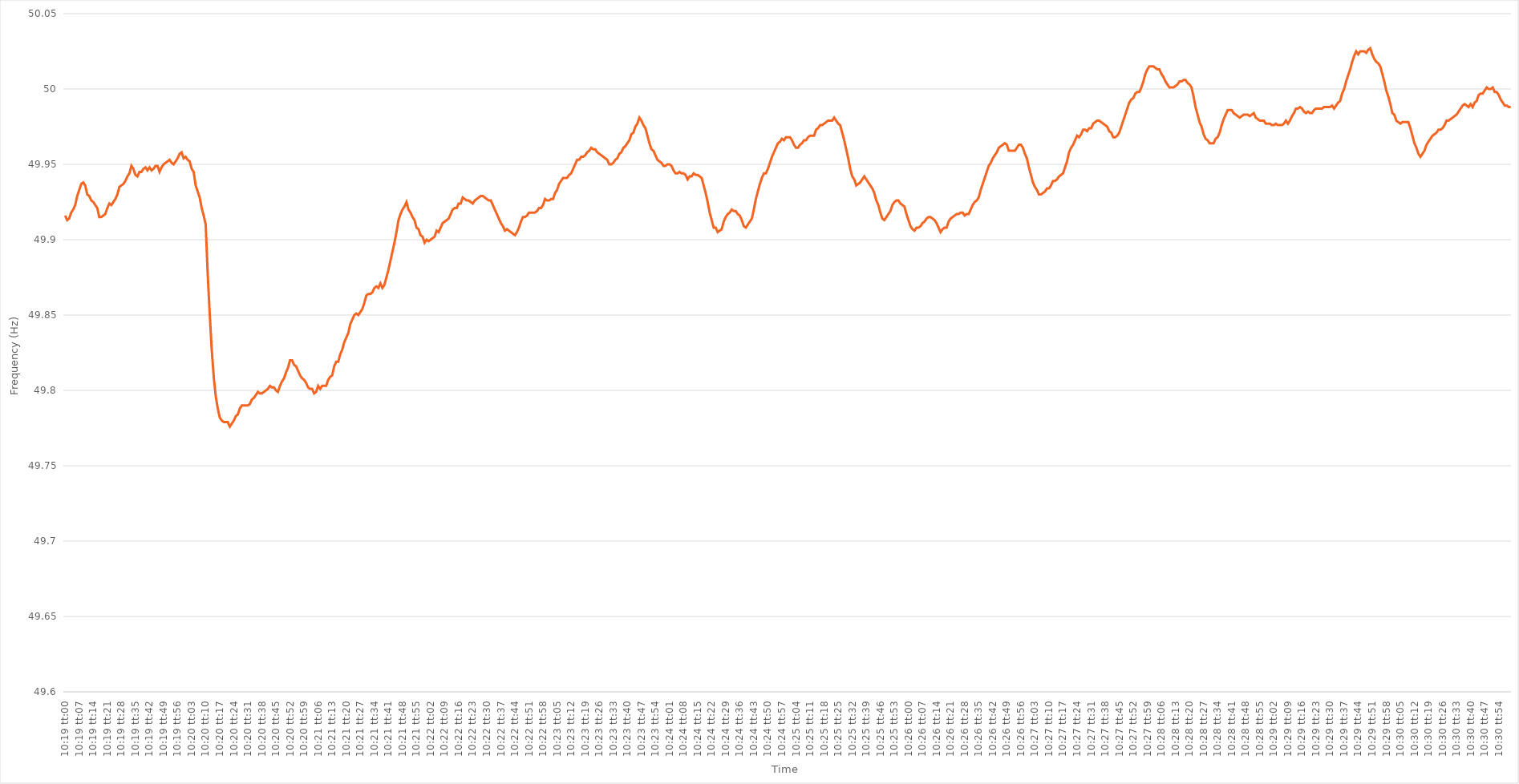
| Category | Series 0 |
|---|---|
| 0.4298611111111111 | 49.916 |
| 0.42987268518518523 | 49.913 |
| 0.42988425925925927 | 49.914 |
| 0.42989583333333337 | 49.918 |
| 0.4299074074074074 | 49.92 |
| 0.4299189814814815 | 49.923 |
| 0.42993055555555554 | 49.929 |
| 0.4299421296296296 | 49.933 |
| 0.4299537037037037 | 49.937 |
| 0.42996527777777777 | 49.938 |
| 0.42997685185185186 | 49.936 |
| 0.4299884259259259 | 49.93 |
| 0.43 | 49.929 |
| 0.43001157407407403 | 49.926 |
| 0.4300231481481482 | 49.925 |
| 0.4300347222222222 | 49.923 |
| 0.4300462962962963 | 49.921 |
| 0.43005787037037035 | 49.915 |
| 0.43006944444444445 | 49.915 |
| 0.4300810185185185 | 49.916 |
| 0.43009259259259264 | 49.917 |
| 0.4301041666666667 | 49.921 |
| 0.43011574074074077 | 49.924 |
| 0.4301273148148148 | 49.923 |
| 0.4301388888888889 | 49.925 |
| 0.43015046296296294 | 49.927 |
| 0.430162037037037 | 49.93 |
| 0.43017361111111113 | 49.935 |
| 0.43018518518518517 | 49.936 |
| 0.43019675925925926 | 49.937 |
| 0.4302083333333333 | 49.939 |
| 0.4302199074074074 | 49.942 |
| 0.43023148148148144 | 49.944 |
| 0.4302430555555556 | 49.949 |
| 0.4302546296296296 | 49.947 |
| 0.4302662037037037 | 49.943 |
| 0.43027777777777776 | 49.942 |
| 0.43028935185185185 | 49.945 |
| 0.4303009259259259 | 49.945 |
| 0.43031250000000004 | 49.947 |
| 0.4303240740740741 | 49.948 |
| 0.4303356481481482 | 49.946 |
| 0.4303472222222222 | 49.948 |
| 0.4303587962962963 | 49.946 |
| 0.43037037037037035 | 49.947 |
| 0.4303819444444445 | 49.949 |
| 0.43039351851851854 | 49.949 |
| 0.43040509259259263 | 49.945 |
| 0.43041666666666667 | 49.948 |
| 0.4304282407407407 | 49.95 |
| 0.4304398148148148 | 49.951 |
| 0.43045138888888884 | 49.952 |
| 0.430462962962963 | 49.953 |
| 0.43047453703703703 | 49.951 |
| 0.4304861111111111 | 49.95 |
| 0.43049768518518516 | 49.952 |
| 0.43050925925925926 | 49.954 |
| 0.4305208333333333 | 49.957 |
| 0.43053240740740745 | 49.958 |
| 0.4305439814814815 | 49.954 |
| 0.4305555555555556 | 49.955 |
| 0.4305671296296296 | 49.953 |
| 0.4305787037037037 | 49.952 |
| 0.43059027777777775 | 49.947 |
| 0.4306018518518519 | 49.945 |
| 0.43061342592592594 | 49.936 |
| 0.43062500000000004 | 49.932 |
| 0.4306365740740741 | 49.928 |
| 0.4306481481481481 | 49.921 |
| 0.4306597222222222 | 49.916 |
| 0.43067129629629625 | 49.91 |
| 0.4306828703703704 | 49.877 |
| 0.43069444444444444 | 49.851 |
| 0.43070601851851853 | 49.827 |
| 0.43071759259259257 | 49.809 |
| 0.43072916666666666 | 49.796 |
| 0.4307407407407407 | 49.788 |
| 0.43075231481481485 | 49.782 |
| 0.4307638888888889 | 49.78 |
| 0.430775462962963 | 49.779 |
| 0.430787037037037 | 49.779 |
| 0.4307986111111111 | 49.779 |
| 0.43081018518518516 | 49.776 |
| 0.4308217592592593 | 49.778 |
| 0.43083333333333335 | 49.78 |
| 0.43084490740740744 | 49.783 |
| 0.4308564814814815 | 49.784 |
| 0.4308680555555555 | 49.788 |
| 0.4308796296296296 | 49.79 |
| 0.43089120370370365 | 49.79 |
| 0.4309027777777778 | 49.79 |
| 0.43091435185185184 | 49.79 |
| 0.43092592592592593 | 49.791 |
| 0.4309375 | 49.794 |
| 0.43094907407407407 | 49.795 |
| 0.4309606481481481 | 49.797 |
| 0.43097222222222226 | 49.799 |
| 0.4309837962962963 | 49.798 |
| 0.4309953703703704 | 49.798 |
| 0.43100694444444443 | 49.799 |
| 0.4310185185185185 | 49.8 |
| 0.43103009259259256 | 49.801 |
| 0.4310416666666667 | 49.803 |
| 0.43105324074074075 | 49.802 |
| 0.43106481481481485 | 49.802 |
| 0.4310763888888889 | 49.8 |
| 0.431087962962963 | 49.799 |
| 0.431099537037037 | 49.803 |
| 0.43111111111111117 | 49.806 |
| 0.4311226851851852 | 49.808 |
| 0.43113425925925924 | 49.812 |
| 0.43114583333333334 | 49.815 |
| 0.4311574074074074 | 49.82 |
| 0.4311689814814815 | 49.82 |
| 0.4311805555555555 | 49.817 |
| 0.43119212962962966 | 49.816 |
| 0.4312037037037037 | 49.813 |
| 0.4312152777777778 | 49.81 |
| 0.43122685185185183 | 49.808 |
| 0.43123842592592593 | 49.807 |
| 0.43124999999999997 | 49.805 |
| 0.4312615740740741 | 49.802 |
| 0.43127314814814816 | 49.801 |
| 0.43128472222222225 | 49.801 |
| 0.4312962962962963 | 49.798 |
| 0.4313078703703704 | 49.799 |
| 0.4313194444444444 | 49.803 |
| 0.43133101851851857 | 49.801 |
| 0.4313425925925926 | 49.803 |
| 0.43135416666666665 | 49.803 |
| 0.43136574074074074 | 49.803 |
| 0.4313773148148148 | 49.807 |
| 0.4313888888888889 | 49.809 |
| 0.4314004629629629 | 49.81 |
| 0.43141203703703707 | 49.816 |
| 0.4314236111111111 | 49.819 |
| 0.4314351851851852 | 49.819 |
| 0.43144675925925924 | 49.824 |
| 0.43145833333333333 | 49.827 |
| 0.43146990740740737 | 49.832 |
| 0.4314814814814815 | 49.835 |
| 0.43149305555555556 | 49.838 |
| 0.43150462962962965 | 49.844 |
| 0.4315162037037037 | 49.847 |
| 0.4315277777777778 | 49.85 |
| 0.4315393518518518 | 49.851 |
| 0.431550925925926 | 49.85 |
| 0.4315625 | 49.852 |
| 0.43157407407407405 | 49.854 |
| 0.43158564814814815 | 49.858 |
| 0.4315972222222222 | 49.863 |
| 0.4316087962962963 | 49.864 |
| 0.4316203703703703 | 49.864 |
| 0.43163194444444447 | 49.865 |
| 0.4316435185185185 | 49.868 |
| 0.4316550925925926 | 49.869 |
| 0.43166666666666664 | 49.868 |
| 0.43167824074074074 | 49.871 |
| 0.4316898148148148 | 49.868 |
| 0.4317013888888889 | 49.87 |
| 0.43171296296296297 | 49.875 |
| 0.43172453703703706 | 49.88 |
| 0.4317361111111111 | 49.886 |
| 0.4317476851851852 | 49.892 |
| 0.43175925925925923 | 49.898 |
| 0.4317708333333334 | 49.905 |
| 0.4317824074074074 | 49.913 |
| 0.4317939814814815 | 49.917 |
| 0.43180555555555555 | 49.92 |
| 0.43181712962962965 | 49.922 |
| 0.4318287037037037 | 49.925 |
| 0.4318402777777777 | 49.92 |
| 0.4318518518518519 | 49.918 |
| 0.4318634259259259 | 49.915 |
| 0.431875 | 49.913 |
| 0.43188657407407405 | 49.908 |
| 0.43189814814814814 | 49.907 |
| 0.4319097222222222 | 49.903 |
| 0.43192129629629633 | 49.902 |
| 0.43193287037037037 | 49.898 |
| 0.43194444444444446 | 49.9 |
| 0.4319560185185185 | 49.899 |
| 0.4319675925925926 | 49.9 |
| 0.43197916666666664 | 49.901 |
| 0.4319907407407408 | 49.902 |
| 0.4320023148148148 | 49.906 |
| 0.4320138888888889 | 49.905 |
| 0.43202546296296296 | 49.908 |
| 0.43203703703703705 | 49.911 |
| 0.4320486111111111 | 49.912 |
| 0.43206018518518513 | 49.913 |
| 0.4320717592592593 | 49.914 |
| 0.4320833333333333 | 49.917 |
| 0.4320949074074074 | 49.92 |
| 0.43210648148148145 | 49.921 |
| 0.43211805555555555 | 49.921 |
| 0.4321296296296296 | 49.924 |
| 0.43214120370370374 | 49.924 |
| 0.4321527777777778 | 49.928 |
| 0.43216435185185187 | 49.927 |
| 0.4321759259259259 | 49.926 |
| 0.4321875 | 49.926 |
| 0.43219907407407404 | 49.925 |
| 0.4322106481481482 | 49.924 |
| 0.43222222222222223 | 49.926 |
| 0.4322337962962963 | 49.927 |
| 0.43224537037037036 | 49.928 |
| 0.43225694444444446 | 49.929 |
| 0.4322685185185185 | 49.929 |
| 0.43228009259259265 | 49.928 |
| 0.4322916666666667 | 49.927 |
| 0.4323032407407407 | 49.926 |
| 0.4323148148148148 | 49.926 |
| 0.43232638888888886 | 49.923 |
| 0.43233796296296295 | 49.92 |
| 0.432349537037037 | 49.917 |
| 0.43236111111111114 | 49.914 |
| 0.4323726851851852 | 49.911 |
| 0.4323842592592593 | 49.909 |
| 0.4323958333333333 | 49.906 |
| 0.4324074074074074 | 49.907 |
| 0.43241898148148145 | 49.906 |
| 0.4324305555555556 | 49.905 |
| 0.43244212962962963 | 49.904 |
| 0.43245370370370373 | 49.903 |
| 0.43246527777777777 | 49.905 |
| 0.43247685185185186 | 49.908 |
| 0.4324884259259259 | 49.912 |
| 0.43250000000000005 | 49.915 |
| 0.4325115740740741 | 49.915 |
| 0.4325231481481482 | 49.916 |
| 0.4325347222222222 | 49.918 |
| 0.43254629629629626 | 49.918 |
| 0.43255787037037036 | 49.918 |
| 0.4325694444444444 | 49.918 |
| 0.43258101851851855 | 49.919 |
| 0.4325925925925926 | 49.921 |
| 0.4326041666666667 | 49.921 |
| 0.4326157407407407 | 49.923 |
| 0.4326273148148148 | 49.927 |
| 0.43263888888888885 | 49.926 |
| 0.432650462962963 | 49.926 |
| 0.43266203703703704 | 49.927 |
| 0.43267361111111113 | 49.927 |
| 0.4326851851851852 | 49.931 |
| 0.43269675925925927 | 49.933 |
| 0.4327083333333333 | 49.937 |
| 0.43271990740740746 | 49.939 |
| 0.4327314814814815 | 49.941 |
| 0.4327430555555556 | 49.941 |
| 0.43275462962962963 | 49.941 |
| 0.43276620370370367 | 49.943 |
| 0.43277777777777776 | 49.944 |
| 0.4327893518518518 | 49.947 |
| 0.43280092592592595 | 49.95 |
| 0.4328125 | 49.953 |
| 0.4328240740740741 | 49.953 |
| 0.4328356481481481 | 49.955 |
| 0.4328472222222222 | 49.955 |
| 0.43285879629629626 | 49.956 |
| 0.4328703703703704 | 49.958 |
| 0.43288194444444444 | 49.959 |
| 0.43289351851851854 | 49.961 |
| 0.4329050925925926 | 49.96 |
| 0.43291666666666667 | 49.96 |
| 0.4329282407407407 | 49.958 |
| 0.43293981481481486 | 49.957 |
| 0.4329513888888889 | 49.956 |
| 0.432962962962963 | 49.955 |
| 0.43297453703703703 | 49.954 |
| 0.4329861111111111 | 49.953 |
| 0.43299768518518517 | 49.95 |
| 0.4330092592592593 | 49.95 |
| 0.43302083333333335 | 49.951 |
| 0.4330324074074074 | 49.953 |
| 0.4330439814814815 | 49.954 |
| 0.4330555555555555 | 49.957 |
| 0.4330671296296296 | 49.958 |
| 0.43307870370370366 | 49.961 |
| 0.4330902777777778 | 49.962 |
| 0.43310185185185185 | 49.964 |
| 0.43311342592592594 | 49.966 |
| 0.433125 | 49.97 |
| 0.4331365740740741 | 49.971 |
| 0.4331481481481481 | 49.975 |
| 0.43315972222222227 | 49.977 |
| 0.4331712962962963 | 49.981 |
| 0.4331828703703704 | 49.979 |
| 0.43319444444444444 | 49.976 |
| 0.43320601851851853 | 49.974 |
| 0.43321759259259257 | 49.969 |
| 0.4332291666666667 | 49.964 |
| 0.43324074074074076 | 49.96 |
| 0.4332523148148148 | 49.959 |
| 0.4332638888888889 | 49.956 |
| 0.43327546296296293 | 49.953 |
| 0.433287037037037 | 49.952 |
| 0.43329861111111106 | 49.951 |
| 0.4333101851851852 | 49.949 |
| 0.43332175925925925 | 49.949 |
| 0.43333333333333335 | 49.95 |
| 0.4333449074074074 | 49.95 |
| 0.4333564814814815 | 49.949 |
| 0.4333680555555555 | 49.946 |
| 0.43337962962962967 | 49.944 |
| 0.4333912037037037 | 49.944 |
| 0.4334027777777778 | 49.945 |
| 0.43341435185185184 | 49.944 |
| 0.43342592592592594 | 49.944 |
| 0.4334375 | 49.943 |
| 0.4334490740740741 | 49.94 |
| 0.43346064814814816 | 49.942 |
| 0.4334722222222222 | 49.942 |
| 0.4334837962962963 | 49.944 |
| 0.43349537037037034 | 49.943 |
| 0.43350694444444443 | 49.943 |
| 0.43351851851851847 | 49.942 |
| 0.4335300925925926 | 49.941 |
| 0.43354166666666666 | 49.936 |
| 0.43355324074074075 | 49.931 |
| 0.4335648148148148 | 49.925 |
| 0.4335763888888889 | 49.918 |
| 0.4335879629629629 | 49.913 |
| 0.4335995370370371 | 49.908 |
| 0.4336111111111111 | 49.908 |
| 0.4336226851851852 | 49.905 |
| 0.43363425925925925 | 49.906 |
| 0.43364583333333334 | 49.907 |
| 0.4336574074074074 | 49.912 |
| 0.43366898148148153 | 49.915 |
| 0.43368055555555557 | 49.917 |
| 0.43369212962962966 | 49.918 |
| 0.4337037037037037 | 49.92 |
| 0.4337152777777778 | 49.919 |
| 0.43372685185185184 | 49.919 |
| 0.4337384259259259 | 49.917 |
| 0.43375 | 49.916 |
| 0.43376157407407406 | 49.913 |
| 0.43377314814814816 | 49.909 |
| 0.4337847222222222 | 49.908 |
| 0.4337962962962963 | 49.91 |
| 0.43380787037037033 | 49.912 |
| 0.4338194444444445 | 49.914 |
| 0.4338310185185185 | 49.92 |
| 0.4338425925925926 | 49.927 |
| 0.43385416666666665 | 49.932 |
| 0.43386574074074075 | 49.937 |
| 0.4338773148148148 | 49.941 |
| 0.43388888888888894 | 49.944 |
| 0.433900462962963 | 49.944 |
| 0.43391203703703707 | 49.947 |
| 0.4339236111111111 | 49.951 |
| 0.4339351851851852 | 49.955 |
| 0.43394675925925924 | 49.958 |
| 0.4339583333333333 | 49.961 |
| 0.43396990740740743 | 49.964 |
| 0.43398148148148147 | 49.965 |
| 0.43399305555555556 | 49.967 |
| 0.4340046296296296 | 49.966 |
| 0.4340162037037037 | 49.968 |
| 0.43402777777777773 | 49.968 |
| 0.4340393518518519 | 49.968 |
| 0.4340509259259259 | 49.966 |
| 0.4340625 | 49.963 |
| 0.43407407407407406 | 49.961 |
| 0.43408564814814815 | 49.961 |
| 0.4340972222222222 | 49.963 |
| 0.43410879629629634 | 49.964 |
| 0.4341203703703704 | 49.966 |
| 0.4341319444444445 | 49.966 |
| 0.4341435185185185 | 49.968 |
| 0.4341550925925926 | 49.969 |
| 0.43416666666666665 | 49.969 |
| 0.4341782407407407 | 49.969 |
| 0.43418981481481483 | 49.973 |
| 0.4342013888888889 | 49.974 |
| 0.43421296296296297 | 49.976 |
| 0.434224537037037 | 49.976 |
| 0.4342361111111111 | 49.977 |
| 0.43424768518518514 | 49.978 |
| 0.4342592592592593 | 49.979 |
| 0.43427083333333333 | 49.979 |
| 0.4342824074074074 | 49.979 |
| 0.43429398148148146 | 49.981 |
| 0.43430555555555556 | 49.979 |
| 0.4343171296296296 | 49.977 |
| 0.43432870370370374 | 49.976 |
| 0.4343402777777778 | 49.971 |
| 0.4343518518518519 | 49.966 |
| 0.4343634259259259 | 49.96 |
| 0.434375 | 49.954 |
| 0.43438657407407405 | 49.947 |
| 0.4343981481481482 | 49.942 |
| 0.43440972222222224 | 49.94 |
| 0.43442129629629633 | 49.936 |
| 0.43443287037037037 | 49.937 |
| 0.4344444444444444 | 49.938 |
| 0.4344560185185185 | 49.94 |
| 0.43446759259259254 | 49.942 |
| 0.4344791666666667 | 49.94 |
| 0.43449074074074073 | 49.938 |
| 0.4345023148148148 | 49.936 |
| 0.43451388888888887 | 49.934 |
| 0.43452546296296296 | 49.931 |
| 0.434537037037037 | 49.926 |
| 0.43454861111111115 | 49.923 |
| 0.4345601851851852 | 49.918 |
| 0.4345717592592593 | 49.914 |
| 0.4345833333333333 | 49.913 |
| 0.4345949074074074 | 49.915 |
| 0.43460648148148145 | 49.917 |
| 0.4346180555555556 | 49.919 |
| 0.43462962962962964 | 49.923 |
| 0.43464120370370374 | 49.925 |
| 0.4346527777777778 | 49.926 |
| 0.4346643518518518 | 49.926 |
| 0.4346759259259259 | 49.924 |
| 0.43468749999999995 | 49.923 |
| 0.4346990740740741 | 49.922 |
| 0.43471064814814814 | 49.917 |
| 0.43472222222222223 | 49.913 |
| 0.43473379629629627 | 49.909 |
| 0.43474537037037037 | 49.907 |
| 0.4347569444444444 | 49.906 |
| 0.43476851851851855 | 49.908 |
| 0.4347800925925926 | 49.908 |
| 0.4347916666666667 | 49.909 |
| 0.4348032407407407 | 49.911 |
| 0.4348148148148148 | 49.912 |
| 0.43482638888888886 | 49.914 |
| 0.434837962962963 | 49.915 |
| 0.43484953703703705 | 49.915 |
| 0.43486111111111114 | 49.914 |
| 0.4348726851851852 | 49.913 |
| 0.4348842592592593 | 49.911 |
| 0.4348958333333333 | 49.908 |
| 0.43490740740740735 | 49.905 |
| 0.4349189814814815 | 49.907 |
| 0.43493055555555554 | 49.908 |
| 0.43494212962962964 | 49.908 |
| 0.4349537037037037 | 49.912 |
| 0.43496527777777777 | 49.914 |
| 0.4349768518518518 | 49.915 |
| 0.43498842592592596 | 49.916 |
| 0.435 | 49.917 |
| 0.4350115740740741 | 49.917 |
| 0.43502314814814813 | 49.918 |
| 0.4350347222222222 | 49.918 |
| 0.43504629629629626 | 49.916 |
| 0.4350578703703704 | 49.917 |
| 0.43506944444444445 | 49.917 |
| 0.43508101851851855 | 49.92 |
| 0.4350925925925926 | 49.923 |
| 0.4351041666666667 | 49.925 |
| 0.4351157407407407 | 49.926 |
| 0.43512731481481487 | 49.928 |
| 0.4351388888888889 | 49.933 |
| 0.43515046296296295 | 49.937 |
| 0.43516203703703704 | 49.941 |
| 0.4351736111111111 | 49.945 |
| 0.4351851851851852 | 49.949 |
| 0.4351967592592592 | 49.951 |
| 0.43520833333333336 | 49.954 |
| 0.4352199074074074 | 49.956 |
| 0.4352314814814815 | 49.958 |
| 0.43524305555555554 | 49.961 |
| 0.43525462962962963 | 49.962 |
| 0.43526620370370367 | 49.963 |
| 0.4352777777777778 | 49.964 |
| 0.43528935185185186 | 49.963 |
| 0.43530092592592595 | 49.959 |
| 0.4353125 | 49.959 |
| 0.4353240740740741 | 49.959 |
| 0.4353356481481481 | 49.959 |
| 0.4353472222222223 | 49.961 |
| 0.4353587962962963 | 49.963 |
| 0.43537037037037035 | 49.963 |
| 0.43538194444444445 | 49.961 |
| 0.4353935185185185 | 49.957 |
| 0.4354050925925926 | 49.954 |
| 0.4354166666666666 | 49.948 |
| 0.43542824074074077 | 49.943 |
| 0.4354398148148148 | 49.938 |
| 0.4354513888888889 | 49.935 |
| 0.43546296296296294 | 49.933 |
| 0.43547453703703703 | 49.93 |
| 0.4354861111111111 | 49.93 |
| 0.4354976851851852 | 49.931 |
| 0.43550925925925926 | 49.932 |
| 0.43552083333333336 | 49.934 |
| 0.4355324074074074 | 49.934 |
| 0.4355439814814815 | 49.936 |
| 0.43555555555555553 | 49.939 |
| 0.4355671296296297 | 49.939 |
| 0.4355787037037037 | 49.94 |
| 0.4355902777777778 | 49.942 |
| 0.43560185185185185 | 49.943 |
| 0.43561342592592595 | 49.944 |
| 0.435625 | 49.948 |
| 0.435636574074074 | 49.952 |
| 0.4356481481481482 | 49.958 |
| 0.4356597222222222 | 49.961 |
| 0.4356712962962963 | 49.963 |
| 0.43568287037037035 | 49.966 |
| 0.43569444444444444 | 49.969 |
| 0.4357060185185185 | 49.968 |
| 0.43571759259259263 | 49.97 |
| 0.43572916666666667 | 49.973 |
| 0.43574074074074076 | 49.973 |
| 0.4357523148148148 | 49.972 |
| 0.4357638888888889 | 49.974 |
| 0.43577546296296293 | 49.974 |
| 0.4357870370370371 | 49.977 |
| 0.4357986111111111 | 49.978 |
| 0.4358101851851852 | 49.979 |
| 0.43582175925925926 | 49.979 |
| 0.43583333333333335 | 49.978 |
| 0.4358449074074074 | 49.977 |
| 0.43585648148148143 | 49.976 |
| 0.4358680555555556 | 49.975 |
| 0.4358796296296296 | 49.972 |
| 0.4358912037037037 | 49.971 |
| 0.43590277777777775 | 49.968 |
| 0.43591435185185184 | 49.968 |
| 0.4359259259259259 | 49.969 |
| 0.43593750000000003 | 49.971 |
| 0.43594907407407407 | 49.975 |
| 0.43596064814814817 | 49.979 |
| 0.4359722222222222 | 49.983 |
| 0.4359837962962963 | 49.987 |
| 0.43599537037037034 | 49.991 |
| 0.4360069444444445 | 49.993 |
| 0.4360185185185185 | 49.994 |
| 0.4360300925925926 | 49.997 |
| 0.43604166666666666 | 49.998 |
| 0.43605324074074076 | 49.998 |
| 0.4360648148148148 | 50.001 |
| 0.43607638888888883 | 50.005 |
| 0.436087962962963 | 50.01 |
| 0.436099537037037 | 50.013 |
| 0.4361111111111111 | 50.015 |
| 0.43612268518518515 | 50.015 |
| 0.43613425925925925 | 50.015 |
| 0.4361458333333333 | 50.014 |
| 0.43615740740740744 | 50.013 |
| 0.4361689814814815 | 50.013 |
| 0.43618055555555557 | 50.01 |
| 0.4361921296296296 | 50.008 |
| 0.4362037037037037 | 50.005 |
| 0.43621527777777774 | 50.003 |
| 0.4362268518518519 | 50.001 |
| 0.43623842592592593 | 50.001 |
| 0.43625 | 50.001 |
| 0.43626157407407407 | 50.002 |
| 0.43627314814814816 | 50.003 |
| 0.4362847222222222 | 50.005 |
| 0.43629629629629635 | 50.005 |
| 0.4363078703703704 | 50.006 |
| 0.4363194444444445 | 50.006 |
| 0.4363310185185185 | 50.004 |
| 0.43634259259259256 | 50.003 |
| 0.43635416666666665 | 50.001 |
| 0.4363657407407407 | 49.995 |
| 0.43637731481481484 | 49.988 |
| 0.4363888888888889 | 49.983 |
| 0.436400462962963 | 49.978 |
| 0.436412037037037 | 49.975 |
| 0.4364236111111111 | 49.97 |
| 0.43643518518518515 | 49.967 |
| 0.4364467592592593 | 49.966 |
| 0.43645833333333334 | 49.964 |
| 0.43646990740740743 | 49.964 |
| 0.43648148148148147 | 49.964 |
| 0.43649305555555556 | 49.967 |
| 0.4365046296296296 | 49.968 |
| 0.43651620370370375 | 49.971 |
| 0.4365277777777778 | 49.976 |
| 0.4365393518518519 | 49.98 |
| 0.4365509259259259 | 49.983 |
| 0.43656249999999996 | 49.986 |
| 0.43657407407407406 | 49.986 |
| 0.4365856481481481 | 49.986 |
| 0.43659722222222225 | 49.984 |
| 0.4366087962962963 | 49.983 |
| 0.4366203703703704 | 49.982 |
| 0.4366319444444444 | 49.981 |
| 0.4366435185185185 | 49.982 |
| 0.43665509259259255 | 49.983 |
| 0.4366666666666667 | 49.983 |
| 0.43667824074074074 | 49.983 |
| 0.43668981481481484 | 49.982 |
| 0.4367013888888889 | 49.983 |
| 0.43671296296296297 | 49.984 |
| 0.436724537037037 | 49.981 |
| 0.43673611111111116 | 49.98 |
| 0.4367476851851852 | 49.979 |
| 0.4367592592592593 | 49.979 |
| 0.43677083333333333 | 49.979 |
| 0.43678240740740737 | 49.977 |
| 0.43679398148148146 | 49.977 |
| 0.4368055555555555 | 49.977 |
| 0.43681712962962965 | 49.976 |
| 0.4368287037037037 | 49.976 |
| 0.4368402777777778 | 49.977 |
| 0.4368518518518518 | 49.976 |
| 0.4368634259259259 | 49.976 |
| 0.43687499999999996 | 49.976 |
| 0.4368865740740741 | 49.977 |
| 0.43689814814814815 | 49.979 |
| 0.43690972222222224 | 49.977 |
| 0.4369212962962963 | 49.979 |
| 0.4369328703703704 | 49.982 |
| 0.4369444444444444 | 49.984 |
| 0.43695601851851856 | 49.987 |
| 0.4369675925925926 | 49.987 |
| 0.4369791666666667 | 49.988 |
| 0.43699074074074074 | 49.987 |
| 0.43700231481481483 | 49.985 |
| 0.43701388888888887 | 49.984 |
| 0.437025462962963 | 49.985 |
| 0.43703703703703706 | 49.984 |
| 0.4370486111111111 | 49.984 |
| 0.4370601851851852 | 49.986 |
| 0.43707175925925923 | 49.987 |
| 0.4370833333333333 | 49.987 |
| 0.43709490740740736 | 49.987 |
| 0.4371064814814815 | 49.987 |
| 0.43711805555555555 | 49.988 |
| 0.43712962962962965 | 49.988 |
| 0.4371412037037037 | 49.988 |
| 0.4371527777777778 | 49.988 |
| 0.4371643518518518 | 49.989 |
| 0.43717592592592597 | 49.987 |
| 0.4371875 | 49.989 |
| 0.4371990740740741 | 49.991 |
| 0.43721064814814814 | 49.992 |
| 0.43722222222222223 | 49.997 |
| 0.4372337962962963 | 50 |
| 0.4372453703703704 | 50.005 |
| 0.43725694444444446 | 50.009 |
| 0.4372685185185185 | 50.013 |
| 0.4372800925925926 | 50.018 |
| 0.43729166666666663 | 50.022 |
| 0.43730324074074073 | 50.025 |
| 0.43731481481481477 | 50.023 |
| 0.4373263888888889 | 50.025 |
| 0.43733796296296296 | 50.025 |
| 0.43734953703703705 | 50.025 |
| 0.4373611111111111 | 50.024 |
| 0.4373726851851852 | 50.026 |
| 0.4373842592592592 | 50.027 |
| 0.4373958333333334 | 50.023 |
| 0.4374074074074074 | 50.02 |
| 0.4374189814814815 | 50.018 |
| 0.43743055555555554 | 50.017 |
| 0.43744212962962964 | 50.015 |
| 0.4374537037037037 | 50.01 |
| 0.43746527777777783 | 50.005 |
| 0.43747685185185187 | 49.999 |
| 0.43748842592592596 | 49.995 |
| 0.4375 | 49.99 |
| 0.43751157407407404 | 49.984 |
| 0.43752314814814813 | 49.983 |
| 0.43753472222222217 | 49.979 |
| 0.4375462962962963 | 49.978 |
| 0.43755787037037036 | 49.977 |
| 0.43756944444444446 | 49.978 |
| 0.4375810185185185 | 49.978 |
| 0.4375925925925926 | 49.978 |
| 0.4376041666666666 | 49.978 |
| 0.4376157407407408 | 49.974 |
| 0.4376273148148148 | 49.969 |
| 0.4376388888888889 | 49.964 |
| 0.43765046296296295 | 49.961 |
| 0.43766203703703704 | 49.957 |
| 0.4376736111111111 | 49.955 |
| 0.43768518518518523 | 49.957 |
| 0.43769675925925927 | 49.959 |
| 0.43770833333333337 | 49.963 |
| 0.4377199074074074 | 49.965 |
| 0.4377314814814815 | 49.967 |
| 0.43774305555555554 | 49.969 |
| 0.4377546296296296 | 49.97 |
| 0.4377662037037037 | 49.971 |
| 0.43777777777777777 | 49.973 |
| 0.43778935185185186 | 49.973 |
| 0.4378009259259259 | 49.974 |
| 0.4378125 | 49.976 |
| 0.43782407407407403 | 49.979 |
| 0.4378356481481482 | 49.979 |
| 0.4378472222222222 | 49.98 |
| 0.4378587962962963 | 49.981 |
| 0.43787037037037035 | 49.982 |
| 0.43788194444444445 | 49.983 |
| 0.4378935185185185 | 49.985 |
| 0.43790509259259264 | 49.987 |
| 0.4379166666666667 | 49.989 |
| 0.43792824074074077 | 49.99 |
| 0.4379398148148148 | 49.989 |
| 0.4379513888888889 | 49.988 |
| 0.43796296296296294 | 49.99 |
| 0.437974537037037 | 49.988 |
| 0.43798611111111113 | 49.991 |
| 0.43799768518518517 | 49.992 |
| 0.43800925925925926 | 49.996 |
| 0.4380208333333333 | 49.997 |
| 0.4380324074074074 | 49.997 |
| 0.43804398148148144 | 49.999 |
| 0.4380555555555556 | 50.001 |
| 0.4380671296296296 | 50 |
| 0.4380787037037037 | 50 |
| 0.43809027777777776 | 50.001 |
| 0.43810185185185185 | 49.998 |
| 0.4381134259259259 | 49.998 |
| 0.43812500000000004 | 49.996 |
| 0.4381365740740741 | 49.993 |
| 0.4381481481481482 | 49.991 |
| 0.4381597222222222 | 49.989 |
| 0.4381712962962963 | 49.989 |
| 0.43818287037037035 | 49.988 |
| 0.4381944444444445 | 49.988 |